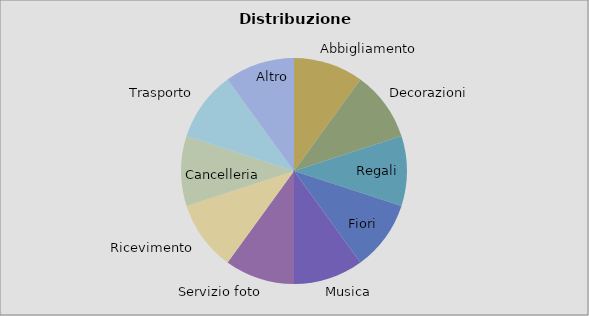
| Category | Importo |
|---|---|
| Abbigliamento | 1 |
| Decorazioni | 1 |
| Regali | 1 |
| Fiori | 1 |
| Musica | 1 |
| Servizio foto | 1 |
| Ricevimento | 1 |
| Cancelleria | 1 |
| Trasporto | 1 |
| Altro | 1 |